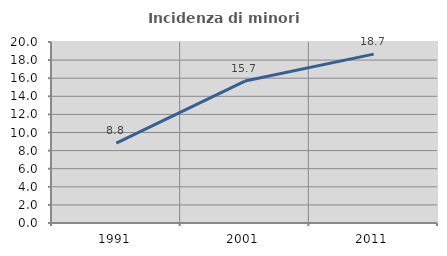
| Category | Incidenza di minori stranieri |
|---|---|
| 1991.0 | 8.824 |
| 2001.0 | 15.686 |
| 2011.0 | 18.661 |